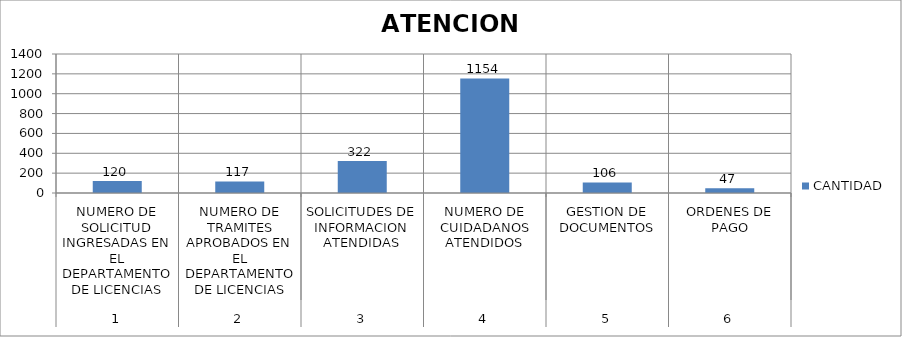
| Category | CANTIDAD |
|---|---|
| 0 | 120 |
| 1 | 117 |
| 2 | 322 |
| 3 | 1154 |
| 4 | 106 |
| 5 | 47 |